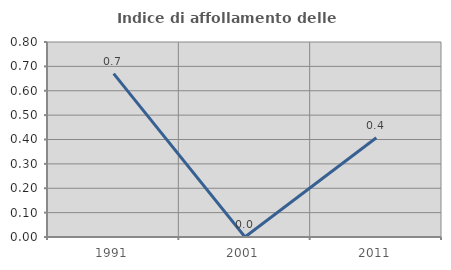
| Category | Indice di affollamento delle abitazioni  |
|---|---|
| 1991.0 | 0.67 |
| 2001.0 | 0 |
| 2011.0 | 0.407 |